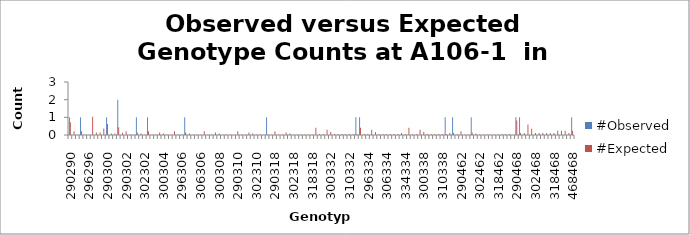
| Category | #Observed | #Expected |
|---|---|---|
| 290290.0 | 1 | 0.721 |
| 290294.0 | 0 | 0.206 |
| 294294.0 | 0 | 0.015 |
| 290296.0 | 1 | 0.206 |
| 294296.0 | 0 | 0.029 |
| 296296.0 | 0 | 0.015 |
| 290298.0 | 0 | 1.029 |
| 294298.0 | 0 | 0.147 |
| 296298.0 | 0 | 0.147 |
| 298298.0 | 0 | 0.368 |
| 290300.0 | 1 | 0.618 |
| 294300.0 | 0 | 0.088 |
| 296300.0 | 0 | 0.088 |
| 298300.0 | 2 | 0.441 |
| 300300.0 | 0 | 0.132 |
| 290302.0 | 0 | 0.206 |
| 294302.0 | 0 | 0.029 |
| 296302.0 | 0 | 0.029 |
| 298302.0 | 1 | 0.147 |
| 300302.0 | 0 | 0.088 |
| 302302.0 | 0 | 0.015 |
| 290304.0 | 1 | 0.206 |
| 294304.0 | 0 | 0.029 |
| 296304.0 | 0 | 0.029 |
| 298304.0 | 0 | 0.147 |
| 300304.0 | 0 | 0.088 |
| 302304.0 | 0 | 0.029 |
| 304304.0 | 0 | 0.015 |
| 290306.0 | 0 | 0.206 |
| 294306.0 | 0 | 0.029 |
| 296306.0 | 0 | 0.029 |
| 298306.0 | 1 | 0.147 |
| 300306.0 | 0 | 0.088 |
| 302306.0 | 0 | 0.029 |
| 304306.0 | 0 | 0.029 |
| 306306.0 | 0 | 0.015 |
| 290308.0 | 0 | 0.206 |
| 294308.0 | 0 | 0.029 |
| 296308.0 | 0 | 0.029 |
| 298308.0 | 0 | 0.147 |
| 300308.0 | 0 | 0.088 |
| 302308.0 | 0 | 0.029 |
| 304308.0 | 0 | 0.029 |
| 306308.0 | 0 | 0.029 |
| 308308.0 | 0 | 0.015 |
| 290310.0 | 0 | 0.206 |
| 294310.0 | 0 | 0.029 |
| 296310.0 | 0 | 0.029 |
| 298310.0 | 0 | 0.147 |
| 300310.0 | 0 | 0.088 |
| 302310.0 | 0 | 0.029 |
| 304310.0 | 0 | 0.029 |
| 306310.0 | 0 | 0.029 |
| 308310.0 | 1 | 0.029 |
| 310310.0 | 0 | 0.015 |
| 290318.0 | 0 | 0.206 |
| 294318.0 | 0 | 0.029 |
| 296318.0 | 0 | 0.029 |
| 298318.0 | 0 | 0.147 |
| 300318.0 | 0 | 0.088 |
| 302318.0 | 0 | 0.029 |
| 304318.0 | 0 | 0.029 |
| 306318.0 | 0 | 0.029 |
| 308318.0 | 0 | 0.029 |
| 310318.0 | 0 | 0.029 |
| 318318.0 | 0 | 0.015 |
| 290332.0 | 0 | 0.412 |
| 294332.0 | 0 | 0.059 |
| 296332.0 | 0 | 0.059 |
| 298332.0 | 0 | 0.294 |
| 300332.0 | 0 | 0.176 |
| 302332.0 | 0 | 0.059 |
| 304332.0 | 0 | 0.059 |
| 306332.0 | 0 | 0.059 |
| 308332.0 | 0 | 0.059 |
| 310332.0 | 0 | 0.059 |
| 318332.0 | 0 | 0.059 |
| 332332.0 | 1 | 0.059 |
| 290334.0 | 1 | 0.412 |
| 294334.0 | 0 | 0.059 |
| 296334.0 | 0 | 0.059 |
| 298334.0 | 0 | 0.294 |
| 300334.0 | 0 | 0.176 |
| 302334.0 | 0 | 0.059 |
| 304334.0 | 0 | 0.059 |
| 306334.0 | 0 | 0.059 |
| 308334.0 | 0 | 0.059 |
| 310334.0 | 0 | 0.059 |
| 318334.0 | 0 | 0.059 |
| 332334.0 | 0 | 0.118 |
| 334334.0 | 0 | 0.059 |
| 290338.0 | 0 | 0.412 |
| 294338.0 | 0 | 0.059 |
| 296338.0 | 0 | 0.059 |
| 298338.0 | 0 | 0.294 |
| 300338.0 | 0 | 0.176 |
| 302338.0 | 0 | 0.059 |
| 304338.0 | 0 | 0.059 |
| 306338.0 | 0 | 0.059 |
| 308338.0 | 0 | 0.059 |
| 310338.0 | 0 | 0.059 |
| 318338.0 | 1 | 0.059 |
| 332338.0 | 0 | 0.118 |
| 334338.0 | 1 | 0.118 |
| 338338.0 | 0 | 0.059 |
| 290462.0 | 0 | 0.206 |
| 294462.0 | 0 | 0.029 |
| 296462.0 | 0 | 0.029 |
| 298462.0 | 1 | 0.147 |
| 300462.0 | 0 | 0.088 |
| 302462.0 | 0 | 0.029 |
| 304462.0 | 0 | 0.029 |
| 306462.0 | 0 | 0.029 |
| 308462.0 | 0 | 0.029 |
| 310462.0 | 0 | 0.029 |
| 318462.0 | 0 | 0.029 |
| 332462.0 | 0 | 0.059 |
| 334462.0 | 0 | 0.059 |
| 338462.0 | 0 | 0.059 |
| 462462.0 | 0 | 0.015 |
| 290468.0 | 1 | 0.824 |
| 294468.0 | 1 | 0.118 |
| 296468.0 | 0 | 0.118 |
| 298468.0 | 0 | 0.588 |
| 300468.0 | 0 | 0.353 |
| 302468.0 | 0 | 0.118 |
| 304468.0 | 0 | 0.118 |
| 306468.0 | 0 | 0.118 |
| 308468.0 | 0 | 0.118 |
| 310468.0 | 0 | 0.118 |
| 318468.0 | 0 | 0.118 |
| 332468.0 | 0 | 0.235 |
| 334468.0 | 0 | 0.235 |
| 338468.0 | 0 | 0.235 |
| 462468.0 | 0 | 0.118 |
| 468468.0 | 1 | 0.235 |